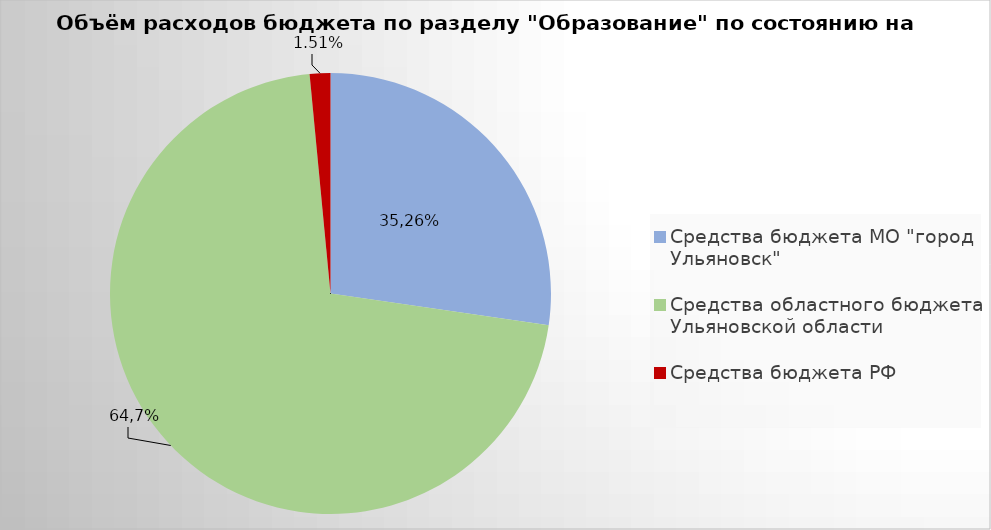
| Category | Series 0 |
|---|---|
| Средства бюджета МО "город Ульяновск" | 1675266.68 |
| Средства областного бюджета Ульяновской области | 4367349.09 |
| Средства бюджета РФ | 92823.5 |